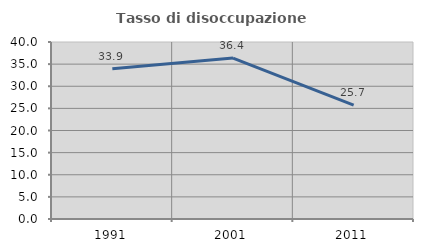
| Category | Tasso di disoccupazione giovanile  |
|---|---|
| 1991.0 | 33.929 |
| 2001.0 | 36.364 |
| 2011.0 | 25.714 |